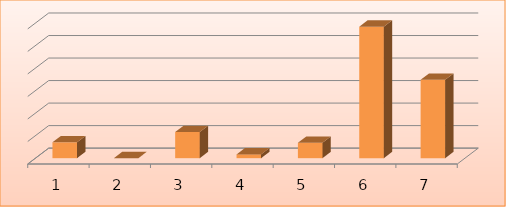
| Category | Series 0 |
|---|---|
| 0 | 3517429 |
| 1 | 2000 |
| 2 | 5812136 |
| 3 | 843125 |
| 4 | 3412850 |
| 5 | 29196703 |
| 6 | 17416028 |